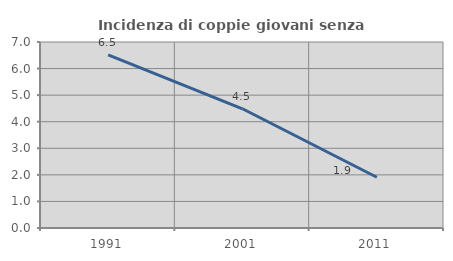
| Category | Incidenza di coppie giovani senza figli |
|---|---|
| 1991.0 | 6.517 |
| 2001.0 | 4.487 |
| 2011.0 | 1.91 |